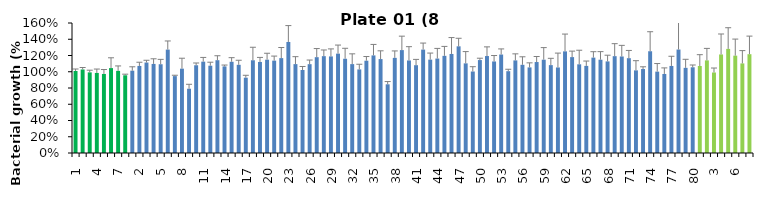
| Category | 8 h % |
|---|---|
| 1.0 | 1.009 |
| 2.0 | 1.028 |
| 3.0 | 0.992 |
| 4.0 | 0.985 |
| 5.0 | 0.973 |
| 6.0 | 1.045 |
| 7.0 | 1.011 |
| 8.0 | 0.956 |
| 1.0 | 1.013 |
| 2.0 | 1.071 |
| 3.0 | 1.113 |
| 4.0 | 1.096 |
| 5.0 | 1.092 |
| 6.0 | 1.273 |
| 7.0 | 0.946 |
| 8.0 | 1.038 |
| 9.0 | 0.791 |
| 10.0 | 1.08 |
| 11.0 | 1.124 |
| 12.0 | 1.075 |
| 13.0 | 1.142 |
| 14.0 | 1.066 |
| 15.0 | 1.123 |
| 16.0 | 1.085 |
| 17.0 | 0.927 |
| 18.0 | 1.141 |
| 19.0 | 1.12 |
| 20.0 | 1.148 |
| 21.0 | 1.137 |
| 22.0 | 1.168 |
| 23.0 | 1.367 |
| 24.0 | 1.094 |
| 25.0 | 1.022 |
| 26.0 | 1.093 |
| 27.0 | 1.179 |
| 28.0 | 1.192 |
| 29.0 | 1.189 |
| 30.0 | 1.223 |
| 31.0 | 1.16 |
| 32.0 | 1.094 |
| 33.0 | 1.029 |
| 34.0 | 1.136 |
| 35.0 | 1.201 |
| 36.0 | 1.156 |
| 37.0 | 0.845 |
| 38.0 | 1.171 |
| 39.0 | 1.267 |
| 40.0 | 1.139 |
| 41.0 | 1.081 |
| 42.0 | 1.273 |
| 43.0 | 1.149 |
| 44.0 | 1.162 |
| 45.0 | 1.196 |
| 46.0 | 1.219 |
| 47.0 | 1.313 |
| 48.0 | 1.103 |
| 49.0 | 1.003 |
| 50.0 | 1.144 |
| 51.0 | 1.193 |
| 52.0 | 1.127 |
| 53.0 | 1.212 |
| 54.0 | 1.007 |
| 55.0 | 1.14 |
| 56.0 | 1.085 |
| 57.0 | 1.054 |
| 58.0 | 1.12 |
| 59.0 | 1.148 |
| 60.0 | 1.082 |
| 61.0 | 1.053 |
| 62.0 | 1.251 |
| 63.0 | 1.18 |
| 64.0 | 1.092 |
| 65.0 | 1.072 |
| 66.0 | 1.174 |
| 67.0 | 1.148 |
| 68.0 | 1.127 |
| 69.0 | 1.192 |
| 70.0 | 1.188 |
| 71.0 | 1.167 |
| 72.0 | 1.017 |
| 73.0 | 1.033 |
| 74.0 | 1.253 |
| 75.0 | 1.002 |
| 76.0 | 0.973 |
| 77.0 | 1.071 |
| 78.0 | 1.274 |
| 79.0 | 1.048 |
| 80.0 | 1.055 |
| 1.0 | 1.071 |
| 2.0 | 1.14 |
| 3.0 | 0.991 |
| 4.0 | 1.213 |
| 5.0 | 1.281 |
| 6.0 | 1.198 |
| 7.0 | 1.103 |
| 8.0 | 1.216 |